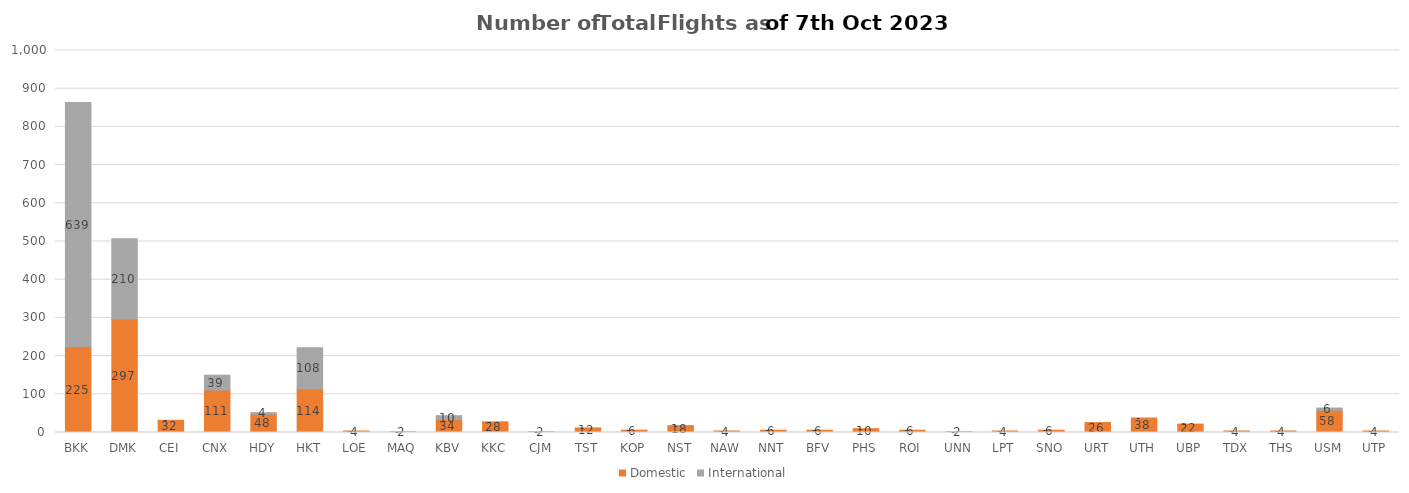
| Category | Domestic | International |
|---|---|---|
| BKK | 225 | 639 |
| DMK | 297 | 210 |
| CEI | 32 | 0 |
| CNX | 111 | 39 |
| HDY | 48 | 4 |
| HKT | 114 | 108 |
| LOE | 4 | 0 |
| MAQ | 2 | 0 |
| KBV | 34 | 10 |
| KKC | 28 | 0 |
| CJM | 2 | 0 |
| TST | 12 | 0 |
| KOP | 6 | 0 |
| NST | 18 | 0 |
| NAW | 4 | 0 |
| NNT | 6 | 0 |
| BFV | 6 | 0 |
| PHS | 10 | 0 |
| ROI | 6 | 0 |
| UNN | 2 | 0 |
| LPT | 4 | 0 |
| SNO | 6 | 0 |
| URT | 26 | 0 |
| UTH | 38 | 0 |
| UBP | 22 | 0 |
| TDX | 4 | 0 |
| THS | 4 | 0 |
| USM | 58 | 6 |
| UTP | 4 | 0 |